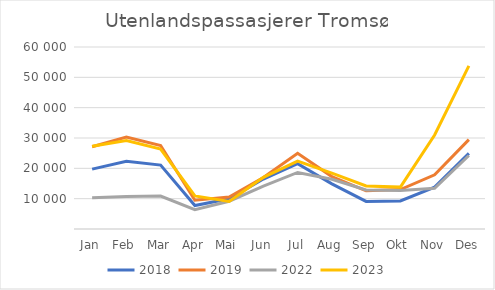
| Category | 2018 | 2019 | 2022 | 2023 |
|---|---|---|---|---|
| Jan | 19748 | 27115 | 10263 | 27291 |
| Feb | 22327 | 30323 | 10732 | 29144 |
| Mar | 21058 | 27536 | 10840 | 26372 |
| Apr | 7723 | 9476 | 6344 | 10890 |
| Mai | 9950 | 10529 | 9158 | 9058 |
| Jun | 16466 | 16996 | 14145 | 17017 |
| Jul | 21551 | 24929 | 18645 | 22399 |
| Aug | 14889 | 17270 | 16386 | 18405 |
| Sep | 9088 | 12588 | 12862 | 14174 |
| Okt | 9239 | 13019 | 12713 | 13813 |
| Nov | 13804 | 17859 | 13394 | 30999 |
| Des | 24910 | 29474 | 24222 | 53757 |